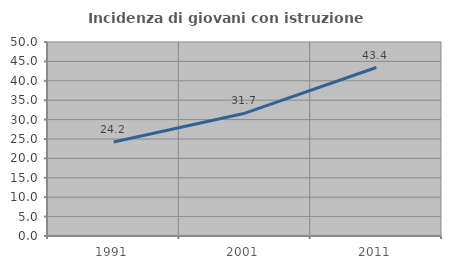
| Category | Incidenza di giovani con istruzione universitaria |
|---|---|
| 1991.0 | 24.216 |
| 2001.0 | 31.652 |
| 2011.0 | 43.426 |